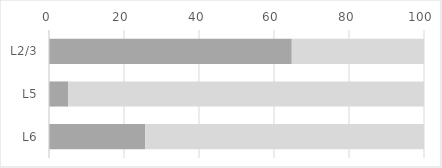
| Category | Series 0 | Series 1 |
|---|---|---|
| L2/3 | 64.738 | 35.262 |
| L5 | 5.096 | 94.904 |
| L6 | 25.641 | 74.359 |